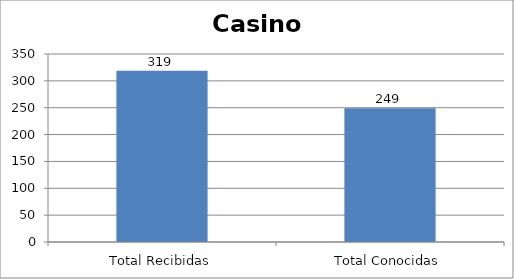
| Category | Series 0 |
|---|---|
| Total Recibidas | 319 |
| Total Conocidas | 249 |